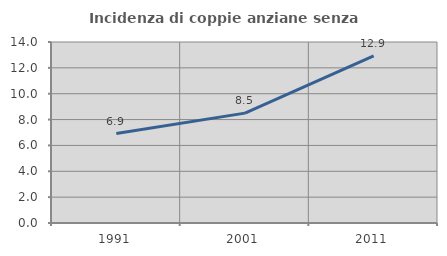
| Category | Incidenza di coppie anziane senza figli  |
|---|---|
| 1991.0 | 6.915 |
| 2001.0 | 8.5 |
| 2011.0 | 12.935 |